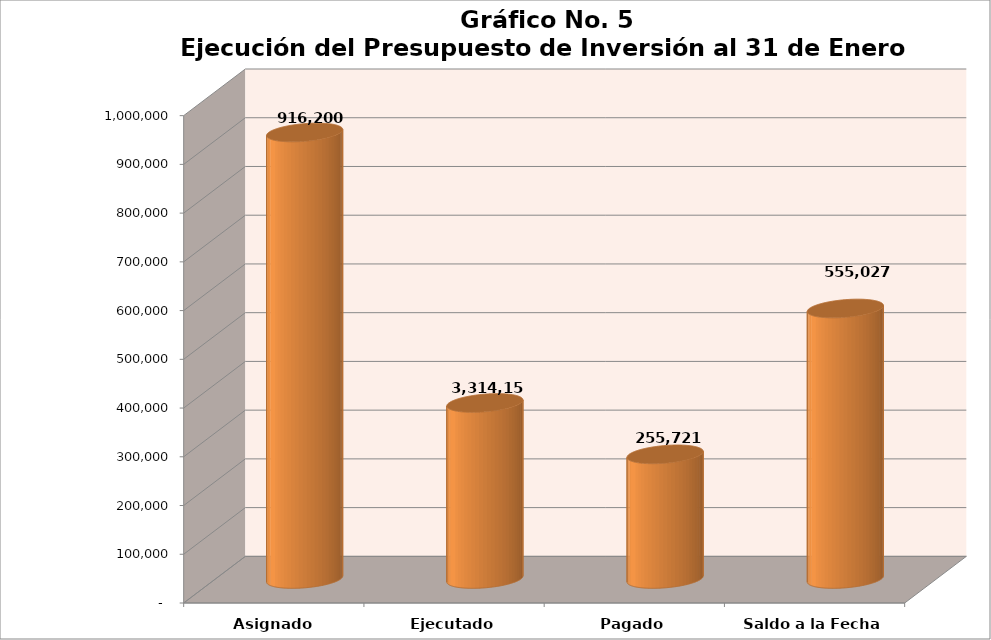
| Category | Series 0 |
|---|---|
| Asignado | 916200 |
| Ejecutado | 361173 |
| Pagado | 255721 |
| Saldo a la Fecha | 555027 |